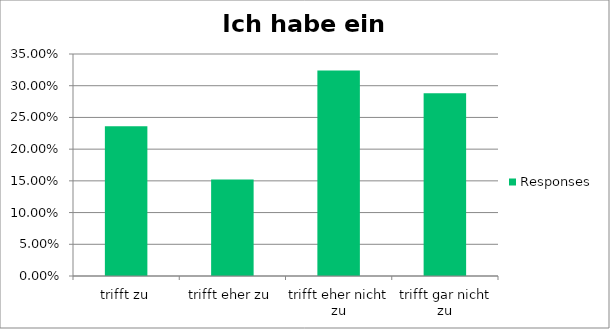
| Category | Responses |
|---|---|
| trifft zu | 0.236 |
| trifft eher zu | 0.152 |
| trifft eher nicht zu | 0.324 |
| trifft gar nicht zu | 0.288 |